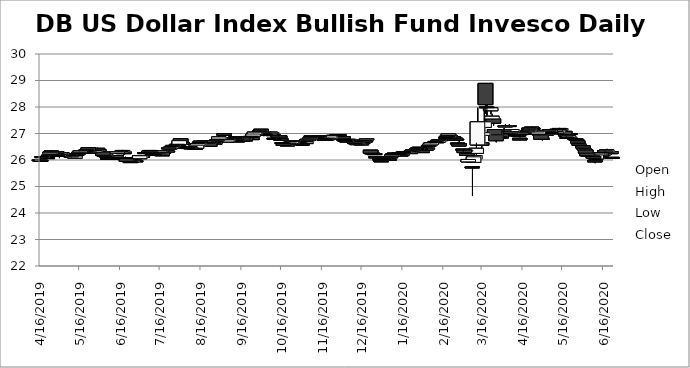
| Category | Open | High | Low | Close |
|---|---|---|---|---|
| 6/23/20 | 26.1 | 26.11 | 26.05 | 26.085 |
| 6/22/20 | 26.32 | 26.32 | 26.214 | 26.24 |
| 6/19/20 | 26.3 | 26.42 | 26.3 | 26.38 |
| 6/18/20 | 26.31 | 26.38 | 26.29 | 26.35 |
| 6/17/20 | 26.24 | 26.33 | 26.24 | 26.25 |
| 6/16/20 | 26.17 | 26.3 | 26.17 | 26.23 |
| 6/15/20 | 26.28 | 26.295 | 26.11 | 26.15 |
| 6/12/20 | 26.18 | 26.37 | 26.135 | 26.26 |
| 6/11/20 | 26.04 | 26.2 | 25.97 | 26.19 |
| 6/10/20 | 25.99 | 26.07 | 25.88 | 25.93 |
| 6/9/20 | 26.14 | 26.15 | 26.025 | 26.06 |
| 6/8/20 | 26.16 | 26.185 | 26.12 | 26.14 |
| 6/5/20 | 26.16 | 26.23 | 26.14 | 26.21 |
| 6/4/20 | 26.28 | 26.28 | 26.1 | 26.16 |
| 6/3/20 | 26.38 | 26.39 | 26.26 | 26.26 |
| 6/2/20 | 26.4 | 26.44 | 26.36 | 26.42 |
| 6/1/20 | 26.53 | 26.55 | 26.45 | 26.45 |
| 5/29/20 | 26.58 | 26.652 | 26.53 | 26.6 |
| 5/28/20 | 26.72 | 26.74 | 26.61 | 26.64 |
| 5/27/20 | 26.78 | 26.87 | 26.76 | 26.78 |
| 5/26/20 | 26.81 | 26.82 | 26.75 | 26.79 |
| 5/22/20 | 27 | 27.03 | 26.98 | 26.99 |
| 5/21/20 | 26.84 | 26.94 | 26.832 | 26.91 |
| 5/20/20 | 26.83 | 26.86 | 26.79 | 26.85 |
| 5/19/20 | 26.93 | 26.945 | 26.87 | 26.94 |
| 5/18/20 | 27.08 | 27.095 | 26.95 | 26.96 |
| 5/15/20 | 27.12 | 27.2 | 27.09 | 27.18 |
| 5/14/20 | 27.19 | 27.21 | 27.13 | 27.16 |
| 5/13/20 | 27.02 | 27.15 | 27 | 27.13 |
| 5/12/20 | 27.02 | 27.08 | 26.99 | 27.08 |
| 5/11/20 | 27.08 | 27.16 | 27.055 | 27.13 |
| 5/8/20 | 27.03 | 27.057 | 26.91 | 27.03 |
| 5/7/20 | 27.15 | 27.18 | 27.011 | 27.04 |
| 5/6/20 | 27.07 | 27.13 | 27.04 | 27.12 |
| 5/5/20 | 27 | 27.03 | 26.9 | 26.99 |
| 5/4/20 | 26.93 | 26.975 | 26.905 | 26.97 |
| 5/1/20 | 26.79 | 26.84 | 26.74 | 26.82 |
| 4/30/20 | 26.97 | 26.997 | 26.756 | 26.79 |
| 4/29/20 | 26.98 | 27.04 | 26.94 | 26.96 |
| 4/28/20 | 26.98 | 27.08 | 26.97 | 27.07 |
| 4/27/20 | 27.06 | 27.13 | 27.05 | 27.1 |
| 4/24/20 | 27.2 | 27.225 | 27.16 | 27.17 |
| 4/23/20 | 27.24 | 27.26 | 27.1 | 27.23 |
| 4/22/20 | 27.1 | 27.23 | 27.1 | 27.22 |
| 4/21/20 | 27.2 | 27.22 | 27.1 | 27.14 |
| 4/20/20 | 27.07 | 27.1 | 27.01 | 27.1 |
| 4/17/20 | 27.02 | 27.035 | 26.974 | 27.01 |
| 4/16/20 | 27.02 | 27.18 | 26.99 | 27.08 |
| 4/15/20 | 27.05 | 27.06 | 26.88 | 26.96 |
| 4/14/20 | 26.82 | 26.84 | 26.755 | 26.76 |
| 4/13/20 | 26.94 | 26.97 | 26.88 | 26.91 |
| 4/9/20 | 26.95 | 27 | 26.89 | 26.95 |
| 4/8/20 | 27.07 | 27.15 | 27.07 | 27.15 |
| 4/7/20 | 27.01 | 27.1 | 27 | 27.05 |
| 4/6/20 | 27.27 | 27.355 | 27.25 | 27.3 |
| 4/3/20 | 27.26 | 27.35 | 27.24 | 27.29 |
| 4/2/20 | 27.12 | 27.205 | 27.04 | 27.14 |
| 4/1/20 | 26.99 | 27.05 | 26.95 | 27 |
| 3/31/20 | 26.98 | 27.05 | 26.79 | 26.83 |
| 3/30/20 | 26.89 | 26.95 | 26.84 | 26.85 |
| 3/27/20 | 27.08 | 27.11 | 26.67 | 26.73 |
| 3/26/20 | 27.15 | 27.159 | 26.94 | 26.95 |
| 3/25/20 | 27.55 | 27.64 | 27.301 | 27.39 |
| 3/24/20 | 27.55 | 27.74 | 27.51 | 27.65 |
| 3/23/20 | 27.86 | 28 | 27.73 | 27.97 |
| 3/20/20 | 28 | 28.075 | 27.681 | 28.01 |
| 3/19/20 | 28.89 | 28.9 | 27.75 | 28.09 |
| 3/18/20 | 27.23 | 28.01 | 27.221 | 27.44 |
| 3/17/20 | 26.93 | 27.1 | 26.91 | 27.03 |
| 3/16/20 | 26.65 | 26.69 | 26.33 | 26.56 |
| 3/13/20 | 26.57 | 27.97 | 26.54 | 27.44 |
| 3/12/20 | 26.25 | 26.655 | 26.19 | 26.44 |
| 3/11/20 | 26.04 | 26.172 | 26.01 | 26.16 |
| 3/10/20 | 25.91 | 26.164 | 25.91 | 26.12 |
| 3/9/20 | 25.74 | 25.745 | 24.64 | 25.74 |
| 3/6/20 | 25.93 | 26.04 | 25.92 | 26.02 |
| 3/5/20 | 26.24 | 26.28 | 26.16 | 26.17 |
| 3/4/20 | 26.37 | 26.41 | 26.34 | 26.37 |
| 3/3/20 | 26.39 | 26.39 | 26.23 | 26.28 |
| 3/2/20 | 26.41 | 26.42 | 26.29 | 26.39 |
| 2/28/20 | 26.62 | 26.71 | 26.49 | 26.53 |
| 2/27/20 | 26.64 | 26.68 | 26.59 | 26.62 |
| 2/26/20 | 26.79 | 26.835 | 26.76 | 26.78 |
| 2/25/20 | 26.83 | 26.841 | 26.73 | 26.76 |
| 2/24/20 | 26.87 | 26.88 | 26.78 | 26.84 |
| 2/21/20 | 26.94 | 26.94 | 26.815 | 26.83 |
| 2/20/20 | 26.94 | 26.99 | 26.933 | 26.99 |
| 2/19/20 | 26.91 | 26.94 | 26.9 | 26.91 |
| 2/18/20 | 26.86 | 26.87 | 26.802 | 26.86 |
| 2/14/20 | 26.77 | 26.78 | 26.73 | 26.76 |
| 2/13/20 | 26.74 | 26.77 | 26.725 | 26.77 |
| 2/12/20 | 26.66 | 26.75 | 26.66 | 26.74 |
| 2/11/20 | 26.69 | 26.69 | 26.655 | 26.67 |
| 2/10/20 | 26.68 | 26.71 | 26.655 | 26.7 |
| 2/7/20 | 26.59 | 26.66 | 26.589 | 26.66 |
| 2/6/20 | 26.55 | 26.62 | 26.55 | 26.6 |
| 2/5/20 | 26.52 | 26.55 | 26.5 | 26.55 |
| 2/4/20 | 26.43 | 26.45 | 26.43 | 26.45 |
| 2/3/20 | 26.38 | 26.425 | 26.38 | 26.41 |
| 1/31/20 | 26.35 | 26.36 | 26.27 | 26.28 |
| 1/30/20 | 26.43 | 26.44 | 26.39 | 26.39 |
| 1/29/20 | 26.48 | 26.49 | 26.44 | 26.47 |
| 1/28/20 | 26.46 | 26.48 | 26.43 | 26.43 |
| 1/27/20 | 26.4 | 26.435 | 26.4 | 26.43 |
| 1/24/20 | 26.38 | 26.42 | 26.38 | 26.39 |
| 1/23/20 | 26.33 | 26.37 | 26.315 | 26.35 |
| 1/22/20 | 26.27 | 26.33 | 26.27 | 26.28 |
| 1/21/20 | 26.26 | 26.31 | 26.26 | 26.3 |
| 1/17/20 | 26.29 | 26.32 | 26.29 | 26.32 |
| 1/16/20 | 26.19 | 26.24 | 26.19 | 26.23 |
| 1/15/20 | 26.18 | 26.215 | 26.18 | 26.19 |
| 1/14/20 | 26.27 | 26.28 | 26.22 | 26.23 |
| 1/13/20 | 26.25 | 26.26 | 26.215 | 26.22 |
| 1/10/20 | 26.26 | 26.265 | 26.21 | 26.22 |
| 1/9/20 | 26.24 | 26.28 | 26.24 | 26.24 |
| 1/8/20 | 26.15 | 26.21 | 26.144 | 26.19 |
| 1/7/20 | 26.1 | 26.14 | 26.1 | 26.12 |
| 1/6/20 | 26.02 | 26.05 | 26.015 | 26.03 |
| 1/3/20 | 26.12 | 26.12 | 26.04 | 26.09 |
| 1/2/20 | 26.05 | 26.08 | 25.993 | 26.06 |
| 12/31/19 | 25.96 | 25.98 | 25.93 | 25.97 |
| 12/30/19 | 26.04 | 26.05 | 26 | 26.04 |
| 12/27/19 | 26.12 | 26.135 | 26.07 | 26.09 |
| 12/26/19 | 26.24 | 26.255 | 26.21 | 26.22 |
| 12/24/19 | 26.27 | 26.28 | 26.24 | 26.26 |
| 12/23/19 | 26.37 | 26.37 | 26.24 | 26.26 |
| 12/20/19 | 26.76 | 26.81 | 26.76 | 26.8 |
| 12/19/19 | 26.72 | 26.73 | 26.69 | 26.71 |
| 12/18/19 | 26.69 | 26.715 | 26.68 | 26.71 |
| 12/17/19 | 26.64 | 26.66 | 26.63 | 26.66 |
| 12/16/19 | 26.59 | 26.63 | 26.572 | 26.61 |
| 12/13/19 | 26.58 | 26.66 | 26.58 | 26.66 |
| 12/12/19 | 26.61 | 26.74 | 26.61 | 26.66 |
| 12/11/19 | 26.7 | 26.72 | 26.59 | 26.62 |
| 12/10/19 | 26.71 | 26.75 | 26.695 | 26.72 |
| 12/9/19 | 26.74 | 26.78 | 26.74 | 26.75 |
| 12/6/19 | 26.76 | 26.82 | 26.75 | 26.78 |
| 12/5/19 | 26.72 | 26.72 | 26.68 | 26.68 |
| 12/4/19 | 26.7 | 26.76 | 26.68 | 26.74 |
| 12/3/19 | 26.77 | 26.79 | 26.75 | 26.77 |
| 12/2/19 | 26.88 | 26.89 | 26.79 | 26.8 |
| 11/29/19 | 26.95 | 26.98 | 26.901 | 26.91 |
| 11/27/19 | 26.94 | 26.96 | 26.93 | 26.94 |
| 11/26/19 | 26.92 | 26.94 | 26.9 | 26.9 |
| 11/25/19 | 26.93 | 26.94 | 26.89 | 26.93 |
| 11/22/19 | 26.81 | 26.92 | 26.81 | 26.91 |
| 11/21/19 | 26.79 | 26.845 | 26.78 | 26.83 |
| 11/20/19 | 26.8 | 26.826 | 26.785 | 26.79 |
| 11/19/19 | 26.77 | 26.79 | 26.76 | 26.79 |
| 11/18/19 | 26.78 | 26.79 | 26.73 | 26.76 |
| 11/15/19 | 26.83 | 26.84 | 26.81 | 26.81 |
| 11/14/19 | 26.91 | 26.925 | 26.845 | 26.87 |
| 11/13/19 | 26.92 | 26.92 | 26.89 | 26.89 |
| 11/12/19 | 26.9 | 26.92 | 26.88 | 26.9 |
| 11/11/19 | 26.87 | 26.87 | 26.85 | 26.86 |
| 11/8/19 | 26.91 | 26.92 | 26.88 | 26.9 |
| 11/7/19 | 26.8 | 26.87 | 26.8 | 26.84 |
| 11/6/19 | 26.75 | 26.79 | 26.75 | 26.78 |
| 11/5/19 | 26.73 | 26.795 | 26.72 | 26.78 |
| 11/4/19 | 26.62 | 26.68 | 26.61 | 26.68 |
| 11/1/19 | 26.6 | 26.61 | 26.56 | 26.58 |
| 10/31/19 | 26.61 | 26.64 | 26.585 | 26.59 |
| 10/30/19 | 26.7 | 26.78 | 26.63 | 26.64 |
| 10/29/19 | 26.71 | 26.72 | 26.67 | 26.7 |
| 10/28/19 | 26.71 | 26.72 | 26.69 | 26.71 |
| 10/25/19 | 26.71 | 26.75 | 26.692 | 26.73 |
| 10/24/19 | 26.61 | 26.72 | 26.61 | 26.7 |
| 10/23/19 | 26.64 | 26.66 | 26.6 | 26.62 |
| 10/22/19 | 26.61 | 26.64 | 26.56 | 26.63 |
| 10/21/19 | 26.54 | 26.59 | 26.54 | 26.57 |
| 10/18/19 | 26.61 | 26.63 | 26.55 | 26.55 |
| 10/17/19 | 26.66 | 26.68 | 26.631 | 26.65 |
| 10/16/19 | 26.8 | 26.82 | 26.73 | 26.75 |
| 10/15/19 | 26.91 | 26.925 | 26.81 | 26.82 |
| 10/14/19 | 26.88 | 26.9 | 26.86 | 26.9 |
| 10/11/19 | 26.82 | 26.86 | 26.795 | 26.82 |
| 10/10/19 | 26.96 | 26.99 | 26.912 | 26.92 |
| 10/9/19 | 27 | 27.054 | 27 | 27.03 |
| 10/8/19 | 27 | 27.08 | 27 | 27.05 |
| 10/7/19 | 26.95 | 27.01 | 26.94 | 27.01 |
| 10/4/19 | 26.98 | 27 | 26.95 | 26.96 |
| 10/3/19 | 27 | 27.01 | 26.9 | 26.98 |
| 10/2/19 | 27.03 | 27.04 | 26.98 | 26.99 |
| 10/1/19 | 27.16 | 27.17 | 27.002 | 27.01 |
| 9/30/19 | 27.1 | 27.11 | 27.06 | 27.1 |
| 9/27/19 | 27.04 | 27.04 | 26.98 | 27.01 |
| 9/26/19 | 26.95 | 27.06 | 26.93 | 27.05 |
| 9/25/19 | 26.9 | 26.99 | 26.88 | 26.98 |
| 9/24/19 | 26.85 | 26.85 | 26.77 | 26.77 |
| 9/23/19 | 26.89 | 26.89 | 26.85 | 26.87 |
| 9/20/19 | 26.83 | 26.86 | 26.82 | 26.83 |
| 9/19/19 | 26.76 | 26.79 | 26.73 | 26.76 |
| 9/18/19 | 26.76 | 26.86 | 26.75 | 26.82 |
| 9/17/19 | 26.82 | 26.84 | 26.718 | 26.72 |
| 9/16/19 | 26.8 | 26.86 | 26.8 | 26.84 |
| 9/13/19 | 26.71 | 26.75 | 26.7 | 26.72 |
| 9/12/19 | 26.88 | 26.9 | 26.72 | 26.76 |
| 9/11/19 | 26.84 | 26.87 | 26.83 | 26.84 |
| 9/10/19 | 26.75 | 26.77 | 26.735 | 26.76 |
| 9/9/19 | 26.74 | 26.75 | 26.7 | 26.73 |
| 9/6/19 | 26.73 | 26.78 | 26.7 | 26.78 |
| 9/5/19 | 26.68 | 26.77 | 26.67 | 26.77 |
| 9/4/19 | 26.82 | 26.83 | 26.75 | 26.76 |
| 9/3/19 | 26.99 | 27.01 | 26.9 | 26.93 |
| 8/30/19 | 26.79 | 26.92 | 26.75 | 26.87 |
| 8/29/19 | 26.73 | 26.79 | 26.7 | 26.77 |
| 8/28/19 | 26.68 | 26.708 | 26.67 | 26.7 |
| 8/27/19 | 26.62 | 26.64 | 26.609 | 26.64 |
| 8/26/19 | 26.62 | 26.66 | 26.61 | 26.66 |
| 8/23/19 | 26.7 | 26.77 | 26.511 | 26.52 |
| 8/22/19 | 26.67 | 26.7 | 26.64 | 26.67 |
| 8/21/19 | 26.67 | 26.71 | 26.655 | 26.69 |
| 8/20/19 | 26.73 | 26.74 | 26.65 | 26.66 |
| 8/19/19 | 26.68 | 26.73 | 26.67 | 26.72 |
| 8/16/19 | 26.71 | 26.71 | 26.64 | 26.66 |
| 8/15/19 | 26.6 | 26.67 | 26.59 | 26.64 |
| 8/14/19 | 26.55 | 26.62 | 26.53 | 26.62 |
| 8/13/19 | 26.44 | 26.56 | 26.43 | 26.56 |
| 8/12/19 | 26.43 | 26.45 | 26.41 | 26.44 |
| 8/9/19 | 26.46 | 26.485 | 26.41 | 26.46 |
| 8/8/19 | 26.51 | 26.51 | 26.42 | 26.49 |
| 8/7/19 | 26.44 | 26.48 | 26.4 | 26.47 |
| 8/6/19 | 26.49 | 26.51 | 26.45 | 26.49 |
| 8/5/19 | 26.48 | 26.5 | 26.415 | 26.46 |
| 8/2/19 | 26.66 | 26.66 | 26.58 | 26.59 |
| 8/1/19 | 26.8 | 26.8 | 26.64 | 26.65 |
| 7/31/19 | 26.58 | 26.74 | 26.55 | 26.73 |
| 7/30/19 | 26.59 | 26.61 | 26.57 | 26.57 |
| 7/29/19 | 26.59 | 26.6 | 26.56 | 26.57 |
| 7/26/19 | 26.52 | 26.576 | 26.52 | 26.55 |
| 7/25/19 | 26.44 | 26.525 | 26.41 | 26.51 |
| 7/24/19 | 26.45 | 26.48 | 26.42 | 26.46 |
| 7/23/19 | 26.43 | 26.47 | 26.43 | 26.46 |
| 7/22/19 | 26.32 | 26.34 | 26.305 | 26.34 |
| 7/19/19 | 26.28 | 26.33 | 26.255 | 26.29 |
| 7/18/19 | 26.3 | 26.32 | 26.16 | 26.16 |
| 7/17/19 | 26.34 | 26.34 | 26.284 | 26.3 |
| 7/16/19 | 26.3 | 26.357 | 26.3 | 26.35 |
| 7/15/19 | 26.19 | 26.23 | 26.19 | 26.23 |
| 7/12/19 | 26.24 | 26.24 | 26.17 | 26.19 |
| 7/11/19 | 26.23 | 26.27 | 26.23 | 26.24 |
| 7/10/19 | 26.29 | 26.305 | 26.231 | 26.24 |
| 7/9/19 | 26.36 | 26.37 | 26.34 | 26.35 |
| 7/8/19 | 26.31 | 26.34 | 26.302 | 26.33 |
| 7/5/19 | 26.27 | 26.335 | 26.27 | 26.28 |
| 7/3/19 | 26.12 | 26.16 | 26.09 | 26.14 |
| 7/2/19 | 26.12 | 26.16 | 26.09 | 26.14 |
| 7/1/19 | 26.05 | 26.17 | 26.042 | 26.16 |
| 6/28/19 | 25.97 | 26.01 | 25.935 | 25.97 |
| 6/27/19 | 25.98 | 26 | 25.975 | 25.99 |
| 6/26/19 | 25.98 | 26.005 | 25.93 | 25.99 |
| 6/25/19 | 25.91 | 26.01 | 25.89 | 25.97 |
| 6/24/19 | 25.94 | 25.96 | 25.9 | 25.91 |
| 6/21/19 | 26.06 | 26.09 | 25.95 | 25.95 |
| 6/20/19 | 26.09 | 26.12 | 26.07 | 26.08 |
| 6/19/19 | 26.31 | 26.33 | 26.19 | 26.24 |
| 6/18/19 | 26.29 | 26.38 | 26.29 | 26.36 |
| 6/17/19 | 26.27 | 26.33 | 26.27 | 26.32 |
| 6/14/19 | 26.26 | 26.33 | 26.24 | 26.31 |
| 6/13/19 | 26.17 | 26.19 | 26.15 | 26.17 |
| 6/12/19 | 26.11 | 26.16 | 26.07 | 26.15 |
| 6/11/19 | 26.08 | 26.108 | 26.06 | 26.08 |
| 6/10/19 | 26.08 | 26.14 | 26.07 | 26.07 |
| 6/7/19 | 26.06 | 26.08 | 25.999 | 26.04 |
| 6/6/19 | 26.15 | 26.19 | 26.09 | 26.15 |
| 6/5/19 | 26.13 | 26.24 | 26.11 | 26.24 |
| 6/4/19 | 26.2 | 26.215 | 26.13 | 26.15 |
| 6/3/19 | 26.3 | 26.3 | 26.15 | 26.18 |
| 5/31/19 | 26.39 | 26.391 | 26.31 | 26.32 |
| 5/30/19 | 26.44 | 26.461 | 26.415 | 26.43 |
| 5/29/19 | 26.4 | 26.43 | 26.38 | 26.42 |
| 5/28/19 | 26.3 | 26.38 | 26.3 | 26.36 |
| 5/24/19 | 26.3 | 26.31 | 26.25 | 26.25 |
| 5/23/19 | 26.46 | 26.47 | 26.31 | 26.34 |
| 5/22/19 | 26.37 | 26.39 | 26.36 | 26.39 |
| 5/21/19 | 26.37 | 26.39 | 26.31 | 26.37 |
| 5/20/19 | 26.34 | 26.34 | 26.32 | 26.33 |
| 5/17/19 | 26.3 | 26.35 | 26.3 | 26.35 |
| 5/16/19 | 26.26 | 26.32 | 26.26 | 26.29 |
| 5/15/19 | 26.24 | 26.255 | 26.192 | 26.22 |
| 5/14/19 | 26.19 | 26.21 | 26.19 | 26.21 |
| 5/13/19 | 26.07 | 26.16 | 26.07 | 26.15 |
| 5/10/19 | 26.12 | 26.158 | 26.09 | 26.15 |
| 5/9/19 | 26.21 | 26.23 | 26.115 | 26.16 |
| 5/8/19 | 26.19 | 26.23 | 26.17 | 26.21 |
| 5/7/19 | 26.21 | 26.25 | 26.19 | 26.2 |
| 5/6/19 | 26.22 | 26.23 | 26.17 | 26.18 |
| 5/3/19 | 26.27 | 26.275 | 26.16 | 26.16 |
| 5/2/19 | 26.21 | 26.27 | 26.21 | 26.26 |
| 5/1/19 | 26.14 | 26.225 | 26.07 | 26.2 |
| 4/30/19 | 26.16 | 26.205 | 26.15 | 26.17 |
| 4/29/19 | 26.31 | 26.33 | 26.25 | 26.25 |
| 4/26/19 | 26.3 | 26.31 | 26.251 | 26.31 |
| 4/25/19 | 26.33 | 26.35 | 26.295 | 26.34 |
| 4/24/19 | 26.23 | 26.34 | 26.19 | 26.29 |
| 4/23/19 | 26.18 | 26.22 | 26.16 | 26.16 |
| 4/22/19 | 26.09 | 26.1 | 26.07 | 26.07 |
| 4/18/19 | 26.09 | 26.14 | 26.08 | 26.13 |
| 4/17/19 | 25.99 | 26.005 | 25.975 | 25.99 |
| 4/16/19 | 25.99 | 26.01 | 25.96 | 26.01 |